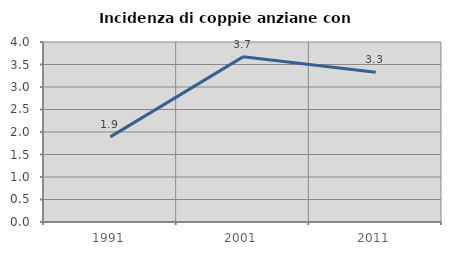
| Category | Incidenza di coppie anziane con figli |
|---|---|
| 1991.0 | 1.892 |
| 2001.0 | 3.67 |
| 2011.0 | 3.33 |